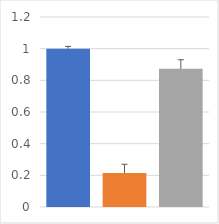
| Category | Series 0 |
|---|---|
| 0 | 1 |
| 1 | 0.215 |
| 2 | 0.873 |